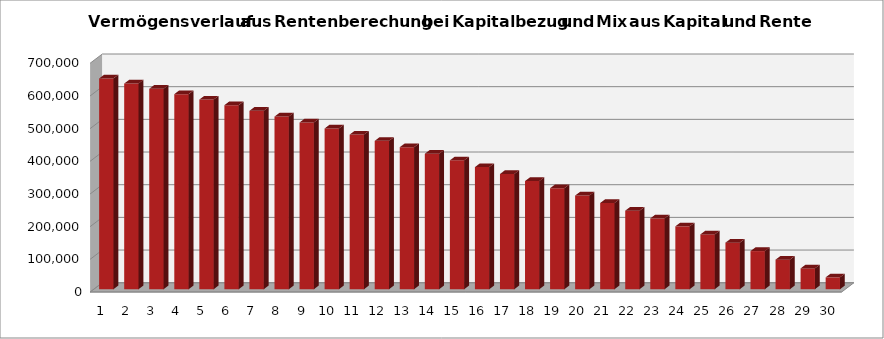
| Category | Series 0 |
|---|---|
| 0 | 645014.106 |
| 1 | 629324.388 |
| 2 | 613320.876 |
| 3 | 596997.294 |
| 4 | 580347.24 |
| 5 | 563364.184 |
| 6 | 546041.468 |
| 7 | 528372.297 |
| 8 | 510349.743 |
| 9 | 491966.738 |
| 10 | 473216.073 |
| 11 | 454090.394 |
| 12 | 434582.202 |
| 13 | 414683.846 |
| 14 | 394387.523 |
| 15 | 373685.274 |
| 16 | 352568.979 |
| 17 | 331030.359 |
| 18 | 309060.966 |
| 19 | 286652.185 |
| 20 | 263795.229 |
| 21 | 240481.134 |
| 22 | 216700.756 |
| 23 | 192444.771 |
| 24 | 167703.667 |
| 25 | 142467.74 |
| 26 | 116727.095 |
| 27 | 90471.637 |
| 28 | 63691.07 |
| 29 | 36374.891 |